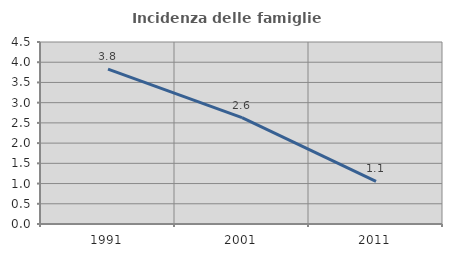
| Category | Incidenza delle famiglie numerose |
|---|---|
| 1991.0 | 3.828 |
| 2001.0 | 2.632 |
| 2011.0 | 1.056 |